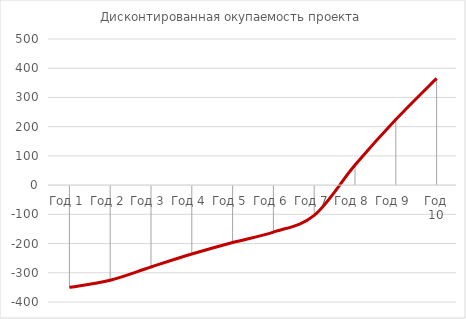
| Category | Дисконтированная окупаемость проекта |
|---|---|
| Год 1 | -350 |
| Год 2 | -325.312 |
| Год 3 | -280.094 |
| Год 4 | -235.939 |
| Год 5 | -196.295 |
| Год 6 | -160.708 |
| Год 7 | -103.418 |
| Год 8 | 68.662 |
| Год 9 | 224.318 |
| Год 10 | 365.109 |